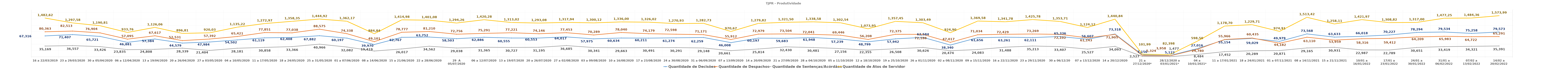
| Category | Quantidade de Decisões | Quantidade de Despachos | Quantidade de Sentenças/Acórdãos |
|---|---|---|---|
| 16 a 22/03/2019 | 67316 | 80363 | 35169 |
| 23 a 29/03/2020 | 71407 | 82513 | 36557 |
| 30 a 05/04/2020 | 65721 | 76904 | 33426 |
| 06 a 12/04/2020 | 46881 | 57095 | 23835 |
| 13 a 19/04/2020 | 57384 | 67617 | 24808 |
| 20 a 26/04/2020 | 44579 | 52531 | 28339 |
| 27 a 03/05/2020 | 47984 | 57392 | 21404 |
| 04 a 10/05/2020 | 54502 | 65421 | 28181 |
| 11 a 17/05/2020 | 61119 | 77851 | 30858 |
| 18 a 24/05/2020 | 62408 | 77038 | 33366 |
| 25 a 31/05/2020 | 67882 | 88575 | 40966 |
| 01 a 07/06/2020 | 60197 | 74338 | 32082 |
| 08 a 14/06/2020 | 39970 | 49101 | 19419 |
| 15 a 21/06/2020 | 62767 | 78777 | 26017 |
| 22 a 28/06/2020 | 63752 | 81210 | 34562 |
| 29  A 05/07/2020 | 58503 | 72756 | 29038 |
| 06 a 12/07/2020 | 62886 | 75291 | 31365 |
| 13 a 19/07/2020 | 60555 | 77221 | 30727 |
| 20 a 26/07/2020 | 60553 | 74146 | 31195 |
| 27 a 02/08/2020 | 64017 | 77453 | 36685 |
| 03 a 09/08/2020 | 57975 | 70289 | 30341 |
| 10 a 16/08/2020 | 60634 | 78040 | 29663 |
| 17 a 23/08/2020 | 60211 | 74179 | 30491 |
| 24 a 30/08/2020 | 61274 | 72598 | 30291 |
| 31 a 06/09/2020 | 62259 | 71171 | 29148 |
| 07 a 13/09/2020 | 46008 | 55912 | 20661 |
| 14 a 20/09/2020 | 60197 | 72979 | 25814 |
| 21 a 27/09/2020 | 59683 | 73504 | 32430 |
| 28 a 04/10/2020 | 61948 | 72041 | 30481 |
| 05 a 11/10/2020 | 57239 | 69446 | 27156 |
| 12 a 18/10/2020 | 48799 | 56208 | 22355 |
| 19 a 25/10/2020 | 57942 | 72375 | 26508 |
| 26 a 01/11/2020 | 62584 | 72188 | 30626 |
| 02 a 08/11/2020 | 38340 | 47017 | 20474 |
| 09 a 15/11/2020 | 61656 | 71034 | 24083 |
| 16 a 22/11/2020 | 63261 | 72429 | 31488 |
| 23 a 29/11/2020 | 62111 | 73269 | 35213 |
| 30 a 06/12/20 | 65336 | 72102 | 33407 |
| 07 a 13/12/2020 | 56607 | 61143 | 25527 |
| 14 a 20/12/2020 | 73318 | 71905 | 34093 |
| 21 a 27/12/2020* | 7156 | 5324 | 2527 |
| 28/12/2020 a 03/01/2021* | 5122 | 3958 | 1477 |
| 04 a 10/01/2021* | 27016 | 24780 | 8484 |
| 11 a 17/01/2021 | 55154 | 55966 | 17452 |
| 18 a 24/01/2021 | 59029 | 60435 | 20289 |
| 01 a 07/11/2021 | 49979 | 44182 | 20871 |
| 08 a 14/11/2021 | 73568 | 63110 | 29165 |
| 15 a 21/11/2021 | 63633 | 53959 | 30931 |
| 10/01 a 16/01/2022 | 66018 | 58316 | 22987 |
| 17/01 a 23/01/2022 | 70227 | 59412 | 22789 |
| 24/01 a 30/01/2022 | 78294 | 64209 | 30651 |
| 31/01 a 06/02/2022 | 79534 | 65983 | 33419 |
| 07/02 a 13/02/2022 | 75258 | 64722 | 34321 |
| 14/02 a 20/02/2022 | 79573 | 65291 | 35391 |